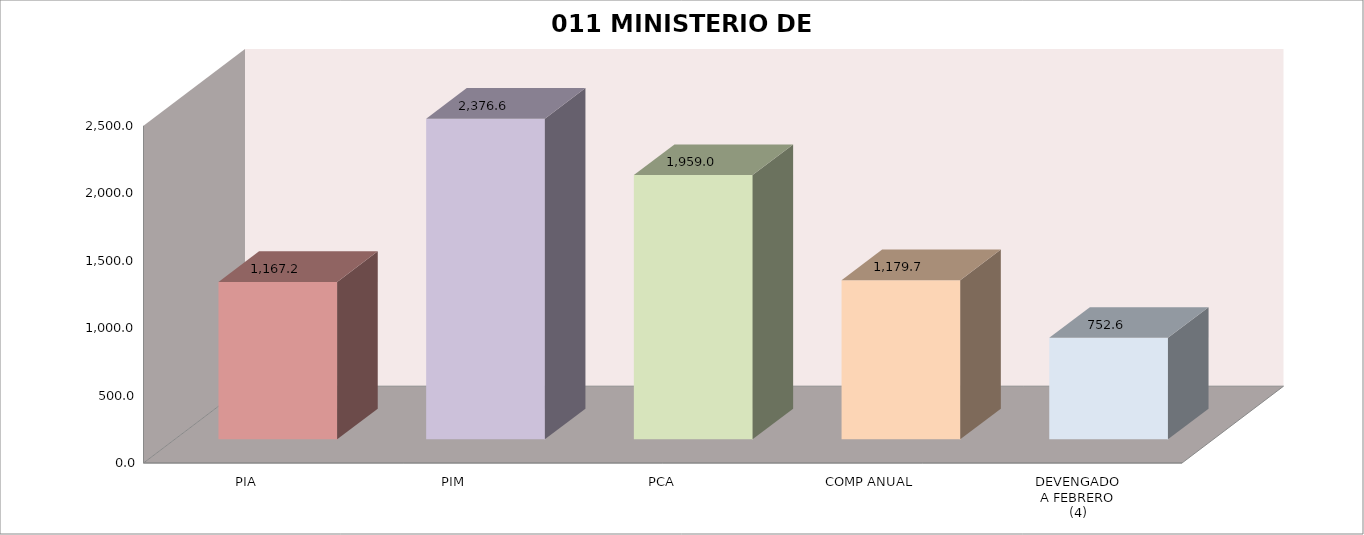
| Category | 011 MINISTERIO DE SALUD |
|---|---|
| PIA | 1167.209 |
| PIM | 2376.645 |
| PCA | 1959.038 |
| COMP ANUAL | 1179.724 |
| DEVENGADO
A FEBRERO
(4) | 752.585 |